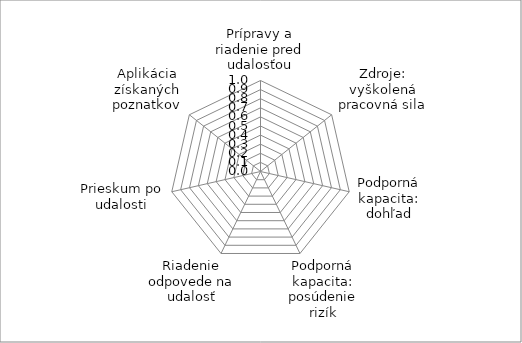
| Category | Series 0 |
|---|---|
| Prípravy a riadenie pred udalosťou | 0 |
| Zdroje: vyškolená pracovná sila | 0 |
| Podporná kapacita: dohľad | 0 |
| Podporná kapacita: posúdenie rizík | 0 |
| Riadenie odpovede na udalosť | 0 |
| Prieskum po udalosti | 0 |
| Aplikácia získaných poznatkov | 0 |